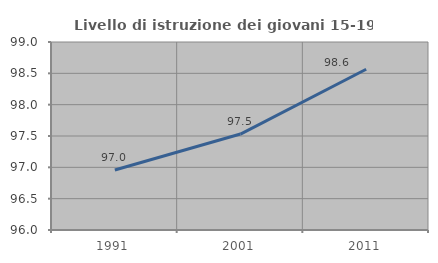
| Category | Livello di istruzione dei giovani 15-19 anni |
|---|---|
| 1991.0 | 96.957 |
| 2001.0 | 97.531 |
| 2011.0 | 98.565 |